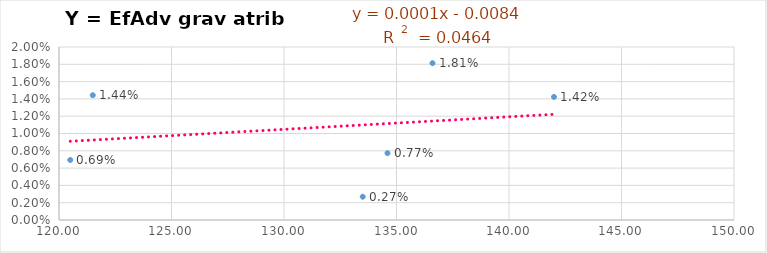
| Category | Y = EfAdv grav atrib /año |
|---|---|
| 120.5 | 0.007 |
| 136.6 | 0.018 |
| 121.5 | 0.014 |
| 133.5 | 0.003 |
| 142.0 | 0.014 |
| 134.6 | 0.008 |